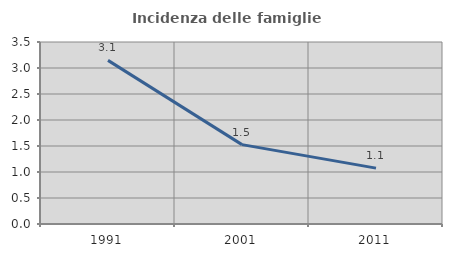
| Category | Incidenza delle famiglie numerose |
|---|---|
| 1991.0 | 3.147 |
| 2001.0 | 1.526 |
| 2011.0 | 1.075 |